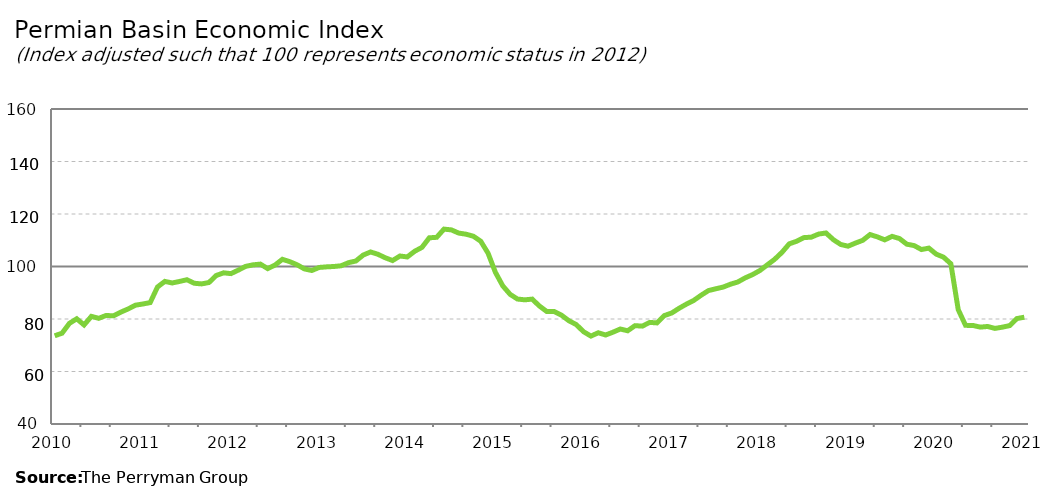
| Category | Permian Basin Composite |
|---|---|
| 2010-01-31 | 73.61 |
| 2010-02-28 | 74.582 |
| 2010-03-31 | 78.326 |
| 2010-04-30 | 80.081 |
| 2010-05-31 | 77.737 |
| 2010-06-30 | 81.007 |
| 2010-07-31 | 80.258 |
| 2010-08-31 | 81.355 |
| 2010-09-30 | 81.206 |
| 2010-10-31 | 82.611 |
| 2010-11-30 | 83.827 |
| 2010-12-31 | 85.266 |
| 2011-01-31 | 85.713 |
| 2011-02-28 | 86.25 |
| 2011-03-31 | 92.204 |
| 2011-04-30 | 94.313 |
| 2011-05-31 | 93.728 |
| 2011-06-30 | 94.308 |
| 2011-07-31 | 94.955 |
| 2011-08-31 | 93.617 |
| 2011-09-30 | 93.369 |
| 2011-10-31 | 93.897 |
| 2011-11-30 | 96.582 |
| 2011-12-31 | 97.592 |
| 2012-01-31 | 97.288 |
| 2012-02-29 | 98.62 |
| 2012-03-31 | 100.045 |
| 2012-04-30 | 100.634 |
| 2012-05-31 | 100.915 |
| 2012-06-30 | 99.194 |
| 2012-07-31 | 100.562 |
| 2012-08-31 | 102.732 |
| 2012-09-30 | 101.85 |
| 2012-10-31 | 100.656 |
| 2012-11-30 | 99.08 |
| 2012-12-31 | 98.471 |
| 2013-01-31 | 99.634 |
| 2013-02-28 | 99.858 |
| 2013-03-31 | 100.002 |
| 2013-04-30 | 100.276 |
| 2013-05-31 | 101.463 |
| 2013-06-30 | 102.091 |
| 2013-07-31 | 104.356 |
| 2013-08-31 | 105.536 |
| 2013-09-30 | 104.663 |
| 2013-10-31 | 103.329 |
| 2013-11-30 | 102.271 |
| 2013-12-31 | 103.997 |
| 2014-01-31 | 103.641 |
| 2014-02-28 | 105.788 |
| 2014-03-31 | 107.291 |
| 2014-04-30 | 110.93 |
| 2014-05-31 | 111.121 |
| 2014-06-30 | 114.24 |
| 2014-07-31 | 113.951 |
| 2014-08-31 | 112.731 |
| 2014-09-30 | 112.302 |
| 2014-10-31 | 111.533 |
| 2014-11-30 | 109.622 |
| 2014-12-31 | 105.055 |
| 2015-01-31 | 97.757 |
| 2015-02-28 | 92.623 |
| 2015-03-31 | 89.401 |
| 2015-04-30 | 87.596 |
| 2015-05-31 | 87.305 |
| 2015-06-30 | 87.571 |
| 2015-07-31 | 84.924 |
| 2015-08-31 | 82.822 |
| 2015-09-30 | 82.842 |
| 2015-10-31 | 81.444 |
| 2015-11-30 | 79.343 |
| 2015-12-31 | 77.881 |
| 2016-01-31 | 75.151 |
| 2016-02-29 | 73.494 |
| 2016-03-31 | 74.756 |
| 2016-04-30 | 73.907 |
| 2016-05-31 | 74.971 |
| 2016-06-30 | 76.188 |
| 2016-07-31 | 75.512 |
| 2016-08-31 | 77.46 |
| 2016-09-30 | 77.289 |
| 2016-10-31 | 78.707 |
| 2016-11-30 | 78.511 |
| 2016-12-31 | 81.311 |
| 2017-01-31 | 82.286 |
| 2017-02-28 | 84.077 |
| 2017-03-31 | 85.666 |
| 2017-04-30 | 87.081 |
| 2017-05-31 | 89.053 |
| 2017-06-30 | 90.824 |
| 2017-07-31 | 91.515 |
| 2017-08-31 | 92.159 |
| 2017-09-30 | 93.255 |
| 2017-10-31 | 94.105 |
| 2017-11-30 | 95.666 |
| 2017-12-31 | 96.909 |
| 2018-01-31 | 98.467 |
| 2018-02-28 | 100.602 |
| 2018-03-31 | 102.718 |
| 2018-04-30 | 105.365 |
| 2018-05-31 | 108.633 |
| 2018-06-30 | 109.608 |
| 2018-07-31 | 111.001 |
| 2018-08-31 | 111.184 |
| 2018-09-30 | 112.355 |
| 2018-10-31 | 112.769 |
| 2018-11-30 | 110.238 |
| 2018-12-31 | 108.394 |
| 2019-01-31 | 107.737 |
| 2019-02-28 | 108.909 |
| 2019-03-31 | 109.973 |
| 2019-04-30 | 112.167 |
| 2019-05-31 | 111.277 |
| 2019-06-30 | 110.153 |
| 2019-07-31 | 111.48 |
| 2019-08-31 | 110.65 |
| 2019-09-30 | 108.507 |
| 2019-10-31 | 107.96 |
| 2019-11-30 | 106.46 |
| 2019-12-31 | 107.009 |
| 2020-01-31 | 104.717 |
| 2020-02-29 | 103.56 |
| 2020-03-31 | 101.034 |
| 2020-04-30 | 83.584 |
| 2020-05-31 | 77.576 |
| 2020-06-30 | 77.547 |
| 2020-07-31 | 76.906 |
| 2020-08-31 | 77.151 |
| 2020-09-30 | 76.418 |
| 2020-10-01 | 76.885 |
| 2020-11-01 | 77.478 |
| 2020-12-01 | 80.177 |
| 2021-01-01 | 80.677 |